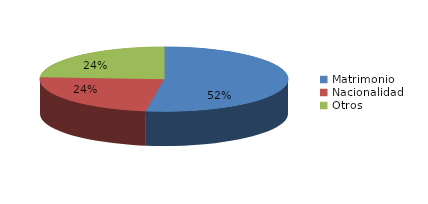
| Category | Series 0 |
|---|---|
| Matrimonio | 2056 |
| Nacionalidad | 925 |
| Otros | 946 |